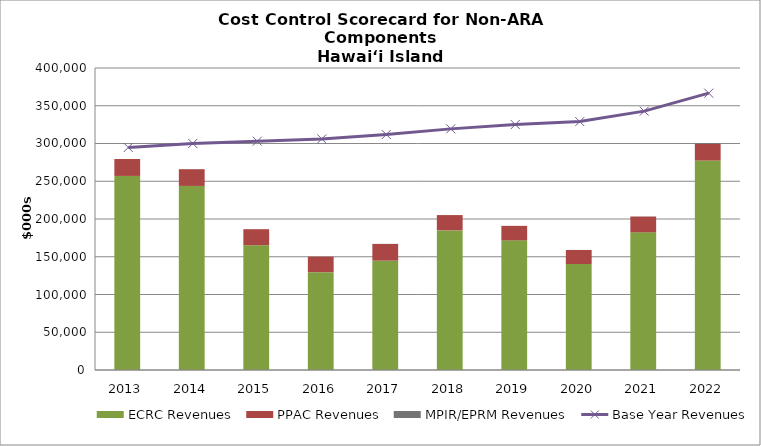
| Category | ECRC Revenues | PPAC Revenues | MPIR/EPRM Revenues |
|---|---|---|---|
| 2013.0 | 257027 | 22435.576 | 0 |
| 2014.0 | 243801 | 22149.598 | 0 |
| 2015.0 | 165266 | 21228.845 | 0 |
| 2016.0 | 129578 | 20533.055 | 0 |
| 2017.0 | 144795 | 22240.964 | 0 |
| 2018.0 | 184897 | 20297.477 | 0 |
| 2019.0 | 171721 | 19204.534 | 0 |
| 2020.0 | 140345 | 18582.266 | 56.671 |
| 2021.0 | 182317 | 20907 | 193.94 |
| 2022.0 | 277407 | 22035 | 991 |